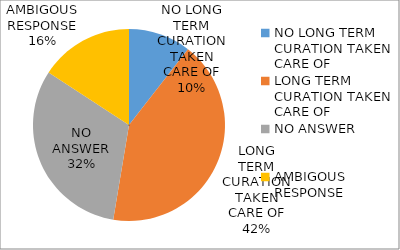
| Category | Series 0 |
|---|---|
| NO LONG TERM CURATION TAKEN CARE OF | 0.105 |
| LONG TERM CURATION TAKEN CARE OF | 0.421 |
| NO ANSWER | 0.316 |
| AMBIGOUS RESPONSE | 0.158 |